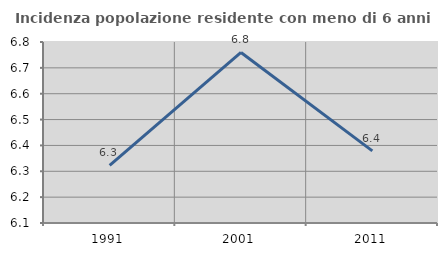
| Category | Incidenza popolazione residente con meno di 6 anni |
|---|---|
| 1991.0 | 6.323 |
| 2001.0 | 6.76 |
| 2011.0 | 6.379 |